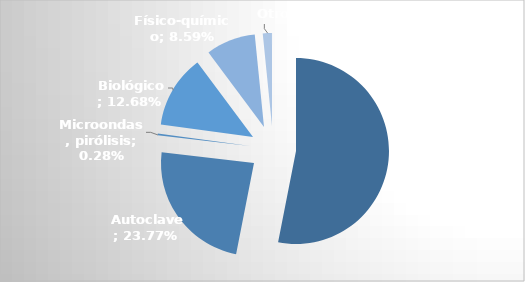
| Category | Series 0 |
|---|---|
| Incineración | 1798374.3 |
|  Autoclave | 805273.61 |
| Microondas, pirólisis | 9624.7 |
|  Biológico | 429594.14 |
| Físico-químico | 291006.14 |
| Otros | 53694.15 |
| Varios | 191.6 |